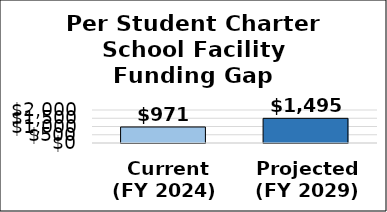
| Category | Facility gap per student |
|---|---|
|  Current
(FY 2024) | 971.451 |
| Projected
(FY 2029) | 1494.767 |